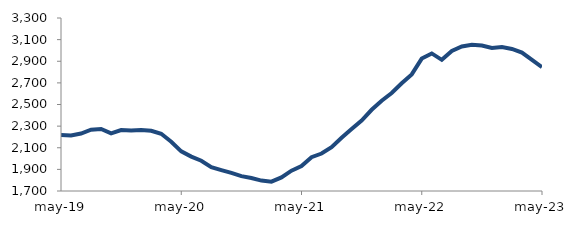
| Category | Series 0 |
|---|---|
| 2019-05-01 | 2218.125 |
| 2019-06-01 | 2213.708 |
| 2019-07-01 | 2231.834 |
| 2019-08-01 | 2267.321 |
| 2019-09-01 | 2273.768 |
| 2019-10-01 | 2233.304 |
| 2019-11-01 | 2263.898 |
| 2019-12-01 | 2259.926 |
| 2020-01-01 | 2265.053 |
| 2020-02-01 | 2256.766 |
| 2020-03-01 | 2229.161 |
| 2020-04-01 | 2155.791 |
| 2020-05-01 | 2066.843 |
| 2020-06-01 | 2018.026 |
| 2020-07-01 | 1979.558 |
| 2020-08-01 | 1920.368 |
| 2020-09-01 | 1893.237 |
| 2020-10-01 | 1867.4 |
| 2020-11-01 | 1837.195 |
| 2020-12-01 | 1819.546 |
| 2021-01-01 | 1796.45 |
| 2021-02-01 | 1786.603 |
| 2021-03-01 | 1826.072 |
| 2021-04-01 | 1887.798 |
| 2021-05-01 | 1930.372 |
| 2021-06-01 | 2012.926 |
| 2021-07-01 | 2046.434 |
| 2021-08-01 | 2105.806 |
| 2021-09-01 | 2192.514 |
| 2021-10-01 | 2272.972 |
| 2021-11-01 | 2351.334 |
| 2021-12-01 | 2451.171 |
| 2022-01-01 | 2534.613 |
| 2022-02-01 | 2606.357 |
| 2022-03-01 | 2696.948 |
| 2022-04-01 | 2778.264 |
| 2022-05-01 | 2924.682 |
| 2022-06-01 | 2972.281 |
| 2022-07-01 | 2912.933 |
| 2022-08-01 | 2994.913 |
| 2022-09-01 | 3036.467 |
| 2022-10-01 | 3052.236 |
| 2022-11-01 | 3044.767 |
| 2022-12-01 | 3023.141 |
| 2023-01-01 | 3030.956 |
| 2023-02-01 | 3013.674 |
| 2023-03-01 | 2979.861 |
| 2023-04-01 | 2913.014 |
| 2023-05-01 | 2845.832 |